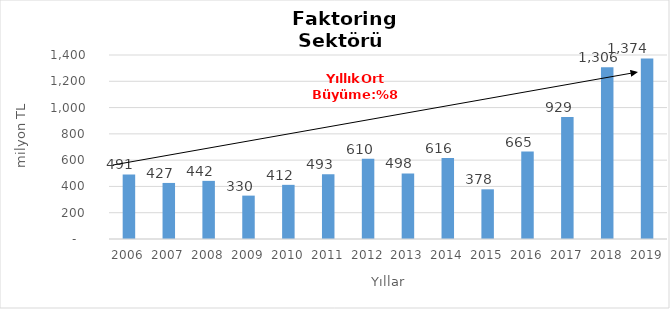
| Category | Faktoring  |
|---|---|
| 2006.0 | 490.834 |
| 2007.0 | 426.554 |
| 2008.0 | 442.315 |
| 2009.0 | 330.082 |
| 2010.0 | 412.077 |
| 2011.0 | 492.71 |
| 2012.0 | 610.081 |
| 2013.0 | 498.446 |
| 2014.0 | 616 |
| 2015.0 | 378 |
| 2016.0 | 665 |
| 2017.0 | 929 |
| 2018.0 | 1306 |
| 2019.0 | 1374 |